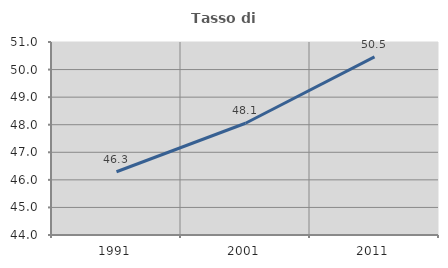
| Category | Tasso di occupazione   |
|---|---|
| 1991.0 | 46.295 |
| 2001.0 | 48.054 |
| 2011.0 | 50.461 |